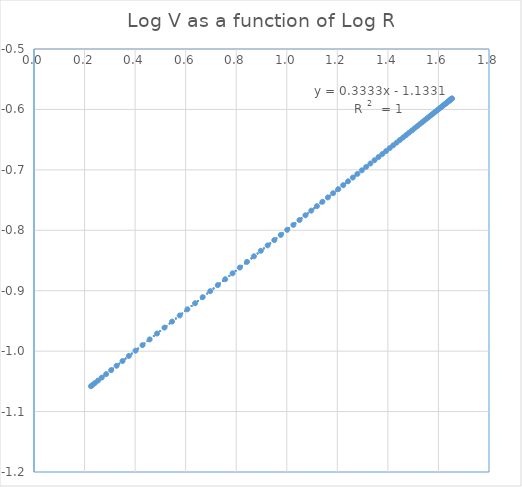
| Category | Log V as a function of Log R |
|---|---|
| 0.22542664694961062 | -1.058 |
| 0.23170630870677963 | -1.056 |
| 0.24100435543959758 | -1.053 |
| 0.253181665774636 | -1.049 |
| 0.26806305966582283 | -1.044 |
| 0.2854448480561697 | -1.038 |
| 0.3051029016997623 | -1.031 |
| 0.32680064425403593 | -1.024 |
| 0.3502964774704209 | -1.016 |
| 0.37535028475968213 | -1.008 |
| 0.40172880627724794 | -0.999 |
| 0.42920981217999504 | -0.99 |
| 0.45758510748816483 | -0.981 |
| 0.48666247672719987 | -0.971 |
| 0.516266720305366 | -0.961 |
| 0.5462399523836363 | -0.951 |
| 0.5764413284929195 | -0.941 |
| 0.6067463569984569 | -0.931 |
| 0.637045927429843 | -0.921 |
| 0.6672451650210911 | -0.911 |
| 0.6972621974995817 | -0.901 |
| 0.7270268990133866 | -0.891 |
| 0.756479657941559 | -0.881 |
| 0.7855702004963143 | -0.871 |
| 0.8142564902850263 | -0.862 |
| 0.8425037151110637 | -0.852 |
| 0.870283365700767 | -0.843 |
| 0.8975724064223778 | -0.834 |
| 0.9243525349044404 | -0.825 |
| 0.9506095254530518 | -0.816 |
| 0.976332650043589 | -0.808 |
| 1.0015141700828756 | -0.799 |
| 1.0261488920482609 | -0.791 |
| 1.0502337802732205 | -0.783 |
| 1.073767620491591 | -0.775 |
| 1.0967507282157352 | -0.768 |
| 1.119184696534743 | -0.76 |
| 1.1410721784250069 | -0.753 |
| 1.1624166992030605 | -0.746 |
| 1.1832224952160548 | -0.739 |
| 1.2034943753271277 | -0.732 |
| 1.223237602181451 | -0.725 |
| 1.2424577905839382 | -0.719 |
| 1.2611608206907678 | -0.713 |
| 1.2793527639844005 | -0.707 |
| 1.2970398202911848 | -0.701 |
| 1.3142282643109722 | -0.695 |
| 1.3309244003418703 | -0.689 |
| 1.3471345240639454 | -0.684 |
| 1.362864890390494 | -0.679 |
| 1.3781216865252937 | -0.674 |
| 1.3929110095060062 | -0.669 |
| 1.4072388475775965 | -0.664 |
| 1.4211110648590042 | -0.659 |
| 1.434533388817673 | -0.655 |
| 1.4475114001509637 | -0.651 |
| 1.4600505247157425 | -0.646 |
| 1.472156027198644 | -0.642 |
| 1.4838330062686114 | -0.639 |
| 1.49508639098321 | -0.635 |
| 1.5059209382466499 | -0.631 |
| 1.5163412311622952 | -0.628 |
| 1.5263516781169113 | -0.624 |
| 1.5359565124929488 | -0.621 |
| 1.5451597928759144 | -0.618 |
| 1.553965403682732 | -0.615 |
| 1.5623770561226276 | -0.612 |
| 1.5703982894210287 | -0.61 |
| 1.5780324722456445 | -0.607 |
| 1.5852828042912128 | -0.605 |
| 1.592152317968417 | -0.602 |
| 1.5986438801649834 | -0.6 |
| 1.6047601940480973 | -0.598 |
| 1.6105038008731787 | -0.596 |
| 1.6158770817849804 | -0.594 |
| 1.6208822595784849 | -0.593 |
| 1.6255214004165857 | -0.591 |
| 1.629796415474964 | -0.59 |
| 1.633709062512894 | -0.589 |
| 1.637260947356307 | -0.587 |
| 1.6404535252729073 | -0.586 |
| 1.6432881022595045 | -0.585 |
| 1.6457658361946748 | -0.585 |
| 1.647887737892742 | -0.584 |
| 1.6496546720259309 | -0.583 |
| 1.6510673579209911 | -0.583 |
| 1.6521263702316438 | -0.582 |
| 1.6528321394734153 | -0.582 |
| 1.653184952431978 | -0.582 |